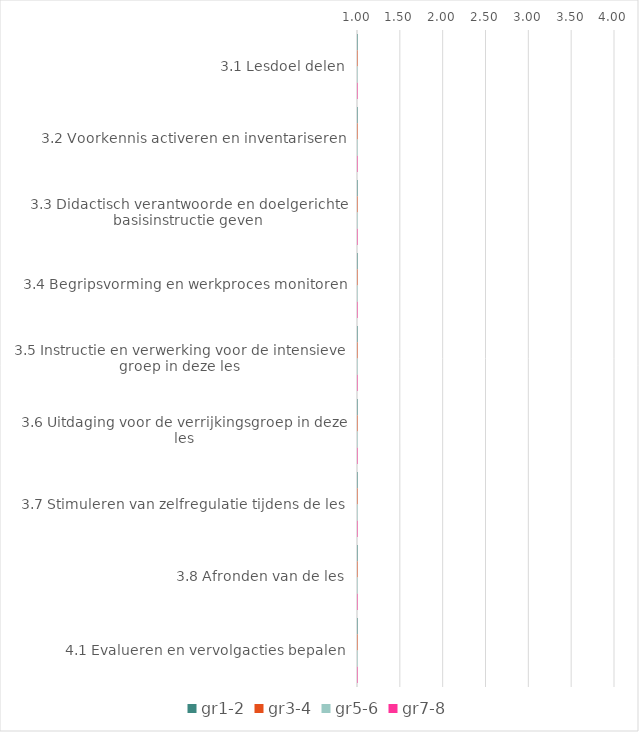
| Category | gr1-2 | gr3-4 | gr5-6 | gr7-8 |
|---|---|---|---|---|
| 3.1 Lesdoel delen | 0 | 0 | 0 | 0 |
| 3.2 Voorkennis activeren en inventariseren | 0 | 0 | 0 | 0 |
| 3.3 Didactisch verantwoorde en doelgerichte basisinstructie geven | 0 | 0 | 0 | 0 |
| 3.4 Begripsvorming en werkproces monitoren | 0 | 0 | 0 | 0 |
| 3.5 Instructie en verwerking voor de intensieve groep in deze les | 0 | 0 | 0 | 0 |
| 3.6 Uitdaging voor de verrijkingsgroep in deze les | 0 | 0 | 0 | 0 |
| 3.7 Stimuleren van zelfregulatie tijdens de les | 0 | 0 | 0 | 0 |
| 3.8 Afronden van de les | 0 | 0 | 0 | 0 |
| 4.1 Evalueren en vervolgacties bepalen | 0 | 0 | 0 | 0 |